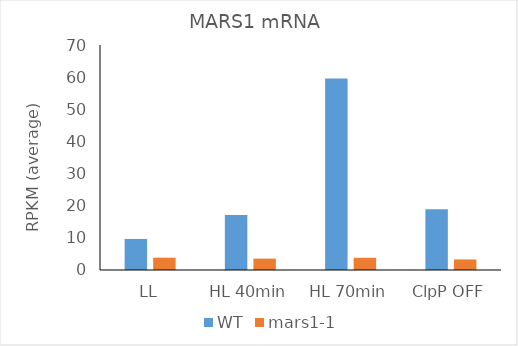
| Category | WT | mars1-1 |
|---|---|---|
| LL | 9.656 | 3.832 |
| HL 40min | 17.112 | 3.54 |
| HL 70min | 59.545 | 3.795 |
| ClpP OFF | 18.879 | 3.288 |